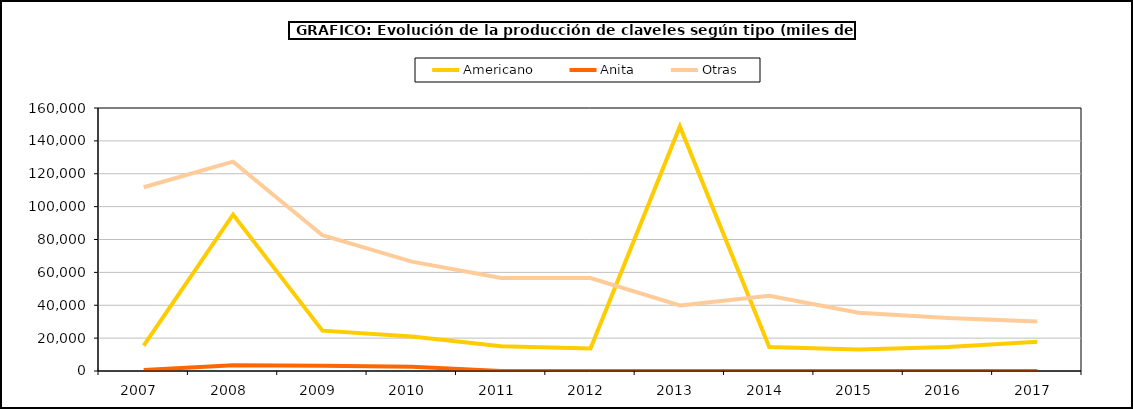
| Category | Americano | Anita | Otras |
|---|---|---|---|
| 2007.0 | 15463 | 580 | 111759 |
| 2008.0 | 95155 | 3544 | 127363 |
| 2009.0 | 24555 | 3160 | 82622 |
| 2010.0 | 20931 | 2642 | 66553 |
| 2011.0 | 15002 | 54 | 56550 |
| 2012.0 | 13658 | 0 | 56550 |
| 2013.0 | 148800 | 0 | 39920 |
| 2014.0 | 14528 | 0 | 45749 |
| 2015.0 | 13065 | 0 | 35460 |
| 2016.0 | 14654 | 0 | 32202 |
| 2017.0 | 17866 | 0 | 30124 |